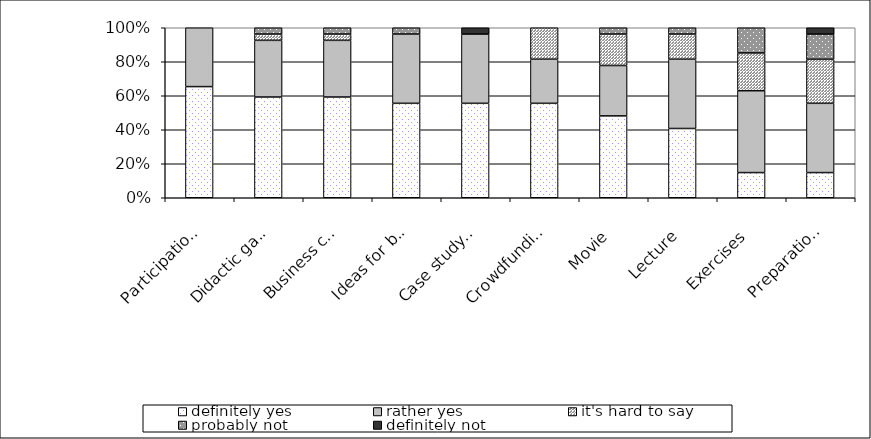
| Category | definitely yes | rather yes | it's hard to say | probably not | definitely not |
|---|---|---|---|---|---|
| Participation of entrepreneurs | 17 | 9 | 0 | 0 | 0 |
| Didactic games | 16 | 9 | 1 | 1 | 0 |
| Business case study | 16 | 9 | 1 | 1 | 0 |
| Ideas for business | 15 | 11 | 0 | 1 | 0 |
| Case study of companies' failures | 15 | 11 | 0 | 0 | 1 |
| Crowdfunding project | 15 | 7 | 5 | 0 | 0 |
| Movie | 13 | 8 | 5 | 1 | 0 |
| Lecture | 11 | 11 | 4 | 1 | 0 |
| Exercises | 4 | 13 | 6 | 4 | 0 |
| Preparation of a business plan | 4 | 11 | 7 | 4 | 1 |